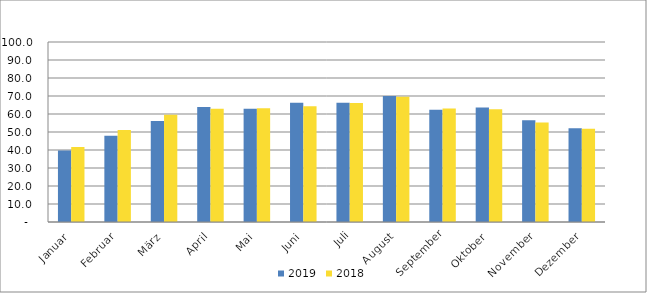
| Category | 2019 | 2018 |
|---|---|---|
| Januar | 39.668 | 41.611 |
| Februar | 47.884 | 51.094 |
| März | 56.047 | 59.586 |
| April | 63.822 | 62.919 |
| Mai | 62.864 | 63.228 |
| Juni | 66.232 | 64.296 |
| Juli | 66.183 | 66.135 |
| August | 70.001 | 69.57 |
| September | 62.381 | 63.113 |
| Oktober | 63.64 | 62.641 |
| November | 56.502 | 55.242 |
| Dezember | 52.115 | 51.8 |